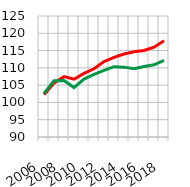
| Category | Schweiz | Kanton SG |
|---|---|---|
| 2006.0 | 102.255 | 102.613 |
| 2007.0 | 105.64 | 106.254 |
| 2008.0 | 107.463 | 106.353 |
| 2009.0 | 106.704 | 104.303 |
| 2010.0 | 108.409 | 106.772 |
| 2011.0 | 109.734 | 108.108 |
| 2012.0 | 111.836 | 109.266 |
| 2013.0 | 113.009 | 110.336 |
| 2014.0 | 114.017 | 110.209 |
| 2015.0 | 114.67 | 109.725 |
| 2016.0 | 115.021 | 110.374 |
| 2017.0 | 115.982 | 110.89 |
| 2018.0 | 117.847 | 112.131 |